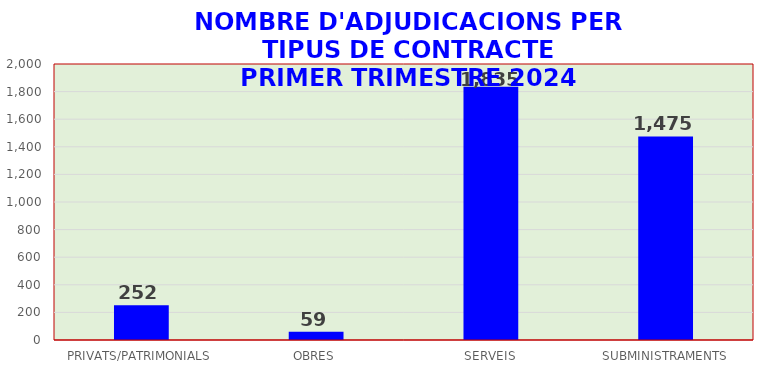
| Category | Series 0 |
|---|---|
| PRIVATS/PATRIMONIALS | 252 |
| OBRES | 59 |
| SERVEIS | 1835 |
| SUBMINISTRAMENTS | 1475 |